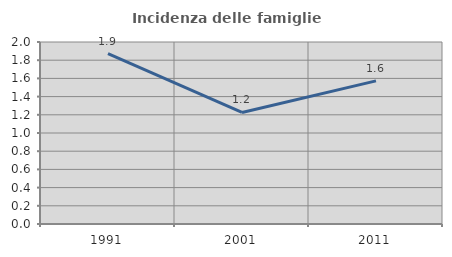
| Category | Incidenza delle famiglie numerose |
|---|---|
| 1991.0 | 1.873 |
| 2001.0 | 1.226 |
| 2011.0 | 1.573 |